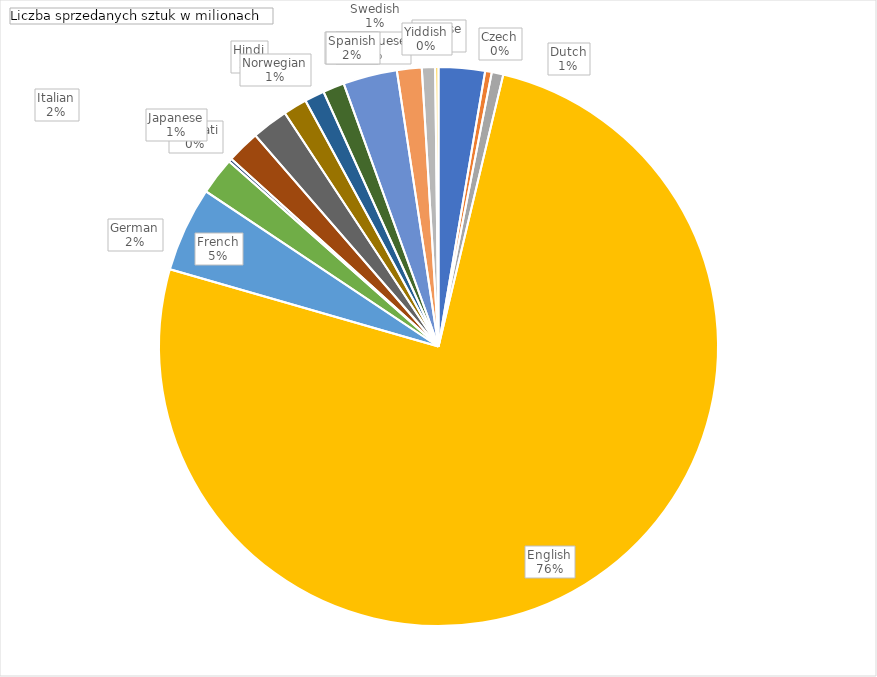
| Category | Suma |
|---|---|
| Chinese | 140 |
| Czech | 20 |
| Dutch | 35 |
| English | 3966 |
| French | 257 |
| German | 113 |
| Gujarati | 10 |
| Hindi | 100 |
| Italian | 110.5 |
| Japanese | 72 |
| Norwegian | 60 |
| Portuguese | 65 |
| Russian | 163.4 |
| Spanish | 75 |
| Swedish | 40 |
| Yiddish | 10 |